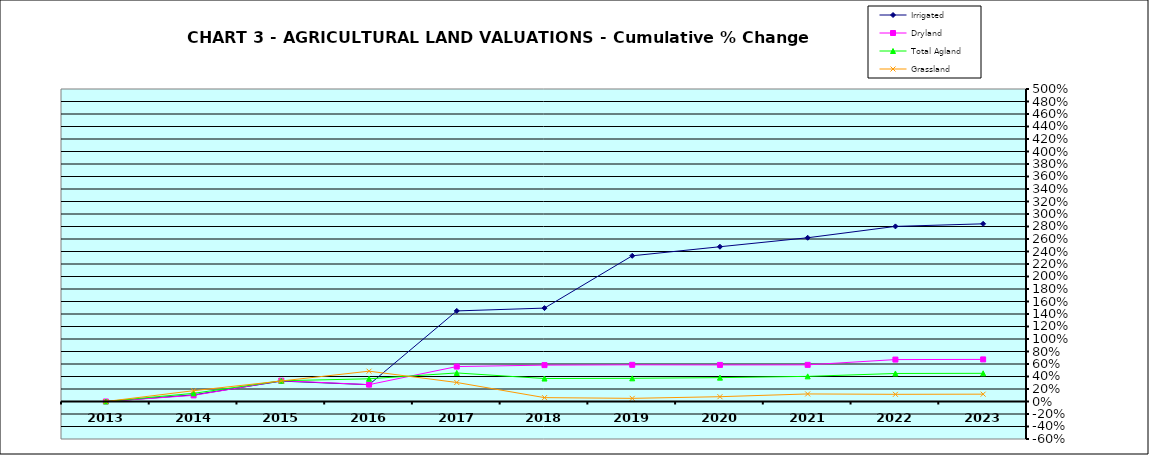
| Category | Irrigated | Dryland | Total Agland | Grassland |
|---|---|---|---|---|
| 2013.0 | 0 | 0 | 0 | 0 |
| 2014.0 | 0.106 | 0.098 | 0.131 | 0.173 |
| 2015.0 | 0.326 | 0.333 | 0.332 | 0.328 |
| 2016.0 | 0.269 | 0.27 | 0.363 | 0.485 |
| 2017.0 | 1.449 | 0.559 | 0.457 | 0.304 |
| 2018.0 | 1.494 | 0.582 | 0.367 | 0.062 |
| 2019.0 | 2.331 | 0.587 | 0.371 | 0.05 |
| 2020.0 | 2.476 | 0.585 | 0.382 | 0.077 |
| 2021.0 | 2.62 | 0.586 | 0.402 | 0.121 |
| 2022.0 | 2.802 | 0.671 | 0.448 | 0.115 |
| 2023.0 | 2.843 | 0.673 | 0.451 | 0.117 |